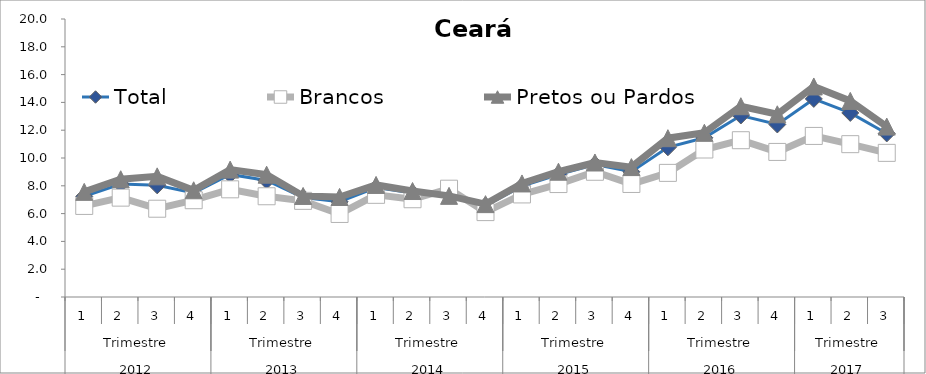
| Category | Total | Brancos | Pretos ou Pardos |
|---|---|---|---|
| 0 | 7.236 | 6.552 | 7.563 |
| 1 | 8.13 | 7.148 | 8.473 |
| 2 | 8.031 | 6.351 | 8.679 |
| 3 | 7.491 | 6.964 | 7.678 |
| 4 | 8.82 | 7.747 | 9.164 |
| 5 | 8.382 | 7.247 | 8.798 |
| 6 | 7.164 | 6.917 | 7.271 |
| 7 | 6.852 | 5.974 | 7.198 |
| 8 | 7.868 | 7.35 | 8.062 |
| 9 | 7.49 | 7.033 | 7.624 |
| 10 | 7.409 | 7.792 | 7.277 |
| 11 | 6.579 | 6.108 | 6.681 |
| 12 | 7.977 | 7.379 | 8.17 |
| 13 | 8.812 | 8.125 | 9.012 |
| 14 | 9.537 | 9.009 | 9.677 |
| 15 | 9.01 | 8.131 | 9.345 |
| 16 | 10.769 | 8.929 | 11.425 |
| 17 | 11.455 | 10.61 | 11.816 |
| 18 | 13.058 | 11.28 | 13.725 |
| 19 | 12.413 | 10.437 | 13.145 |
| 20 | 14.25 | 11.588 | 15.146 |
| 21 | 13.241 | 10.995 | 14.108 |
| 22 | 11.765 | 10.369 | 12.261 |